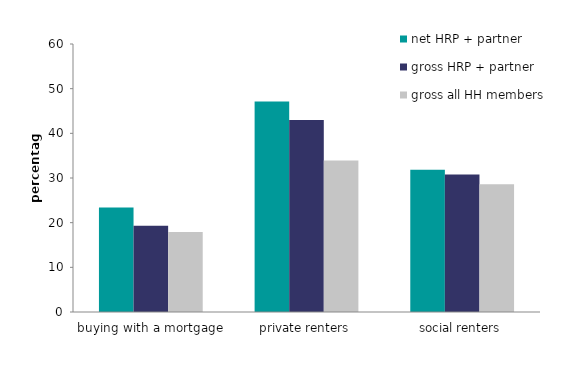
| Category | net HRP + partner | gross HRP + partner | gross all HH members |
|---|---|---|---|
| buying with a mortgage | 23.4 | 19.3 | 17.9 |
| private renters | 47.123 | 43 | 33.9 |
| social renters | 31.865 | 30.8 | 28.6 |